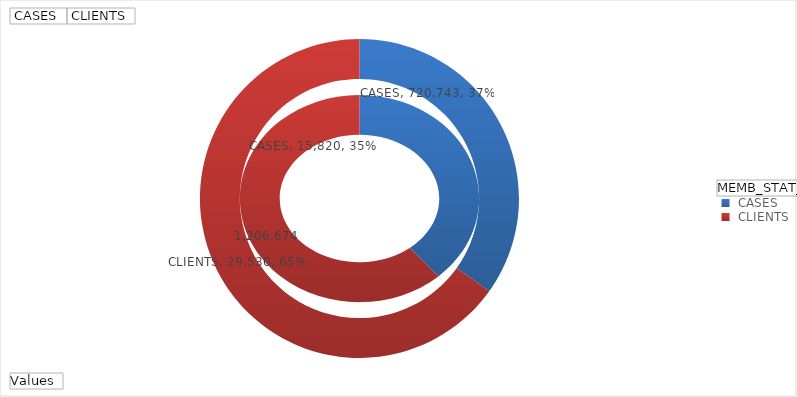
| Category | ACTIVE | CLOSED |
|---|---|---|
|  CASES | 720743 | 15820 |
|  CLIENTS | 1206674 | 29530 |